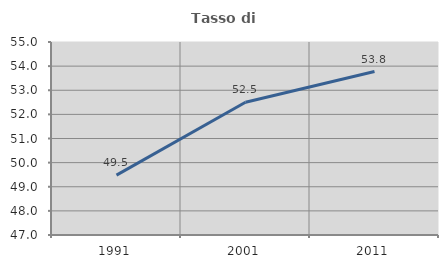
| Category | Tasso di occupazione   |
|---|---|
| 1991.0 | 49.483 |
| 2001.0 | 52.5 |
| 2011.0 | 53.776 |